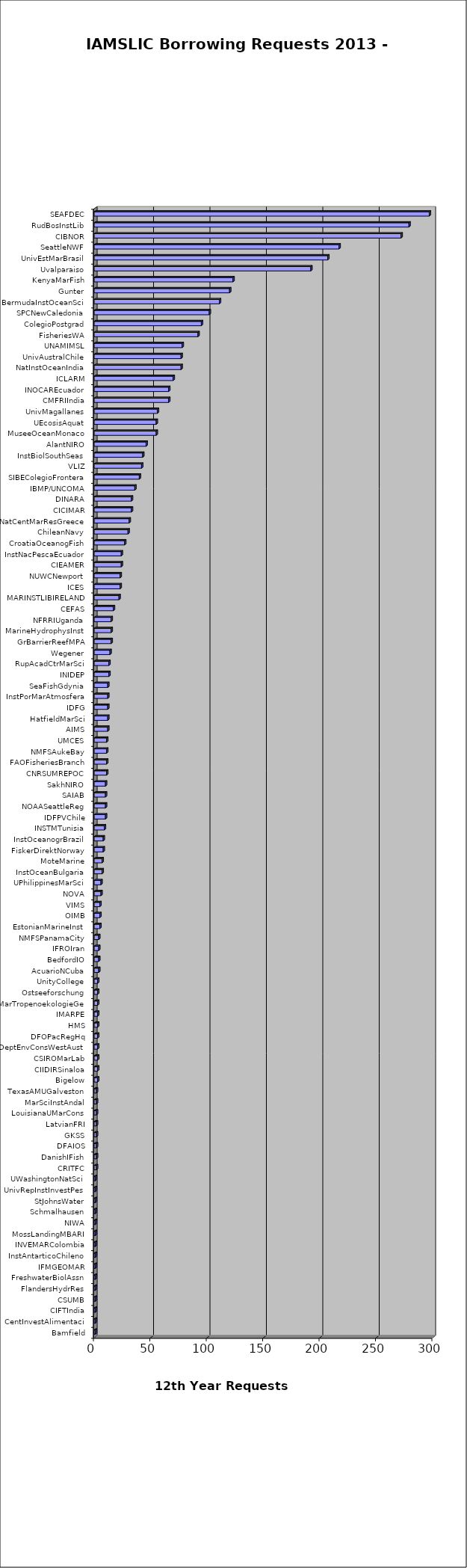
| Category | Series 0 |
|---|---|
| Bamfield | 1 |
| CentInvestAlimentaci | 1 |
| CIFTIndia | 1 |
| CSUMB | 1 |
| FlandersHydrRes | 1 |
| FreshwaterBiolAssn | 1 |
| IFMGEOMAR | 1 |
| InstAntarticoChileno | 1 |
| INVEMARColombia | 1 |
| MossLandingMBARI | 1 |
| NIWA | 1 |
| Schmalhausen | 1 |
| StJohnsWater | 1 |
| UnivRepInstInvestPes | 1 |
| UWashingtonNatSci | 1 |
| CRITFC | 2 |
| DanishIFish | 2 |
| DFAIOS | 2 |
| GKSS | 2 |
| LatvianFRI | 2 |
| LouisianaUMarCons | 2 |
| MarSciInstAndal | 2 |
| TexasAMUGalveston | 2 |
| Bigelow | 3 |
| CIIDIRSinaloa | 3 |
| CSIROMarLab | 3 |
| DeptEnvConsWestAust | 3 |
| DFOPacRegHq | 3 |
| HMS | 3 |
| IMARPE | 3 |
| MarTropenoekologieGe | 3 |
| Ostseeforschung | 3 |
| UnityCollege | 3 |
| AcuarioNCuba | 4 |
| BedfordIO | 4 |
| IFROIran | 4 |
| NMFSPanamaCity | 4 |
| EstonianMarineInst | 5 |
| OIMB | 5 |
| VIMS | 5 |
| NOVA | 6 |
| UPhilippinesMarSci | 6 |
| InstOceanBulgaria | 7 |
| MoteMarine | 7 |
| FiskerDirektNorway | 8 |
| InstOceanogrBrazil | 8 |
| INSTMTunisia | 9 |
| IDFPVChile | 10 |
| NOAASeattleReg | 10 |
| SAIAB | 10 |
| SakhNIRO | 10 |
| CNRSUMREPOC | 11 |
| FAOFisheriesBranch | 11 |
| NMFSAukeBay | 11 |
| UMCES | 11 |
| AIMS | 12 |
| HatfieldMarSci | 12 |
| IDFG | 12 |
| InstPorMarAtmosfera | 12 |
| SeaFishGdynia | 12 |
| INIDEP | 13 |
| RupAcadCtrMarSci | 13 |
| Wegener | 14 |
| GrBarrierReefMPA | 15 |
| MarineHydrophysInst | 15 |
| NFRRIUganda | 15 |
| CEFAS | 17 |
| MARINSTLIBIRELAND | 22 |
| ICES | 23 |
| NUWCNewport | 23 |
| CIEAMER | 24 |
| InstNacPescaEcuador | 24 |
| CroatiaOceanogFish | 27 |
| ChileanNavy | 30 |
| NatCentMarResGreece | 31 |
| CICIMAR | 33 |
| DINARA | 33 |
| IBMP/UNCOMA | 36 |
| SIBEColegioFrontera | 40 |
| VLIZ | 42 |
| InstBiolSouthSeas | 43 |
| AlantNIRO | 46 |
| MuseeOceanMonaco | 55 |
| UEcosisAquat | 55 |
| UnivMagallanes | 56 |
| CMFRIIndia | 66 |
| INOCAREcuador | 66 |
| ICLARM | 70 |
| NatInstOceanIndia | 77 |
| UnivAustralChile | 77 |
| UNAMIMSL | 78 |
| FisheriesWA | 92 |
| ColegioPostgrad | 95 |
| SPCNewCaledonia | 102 |
| BermudaInstOceanSci | 111 |
| Gunter | 120 |
| KenyaMarFish | 123 |
| Uvalparaiso | 192 |
| UnivEstMarBrasil | 207 |
| SeattleNWF | 217 |
| CIBNOR | 272 |
| RudBosInstLib | 279 |
| SEAFDEC | 297 |